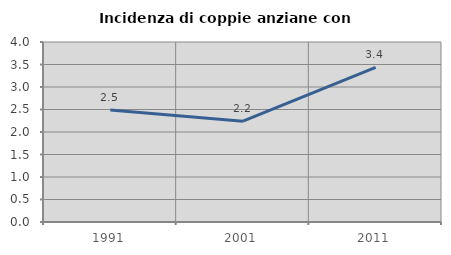
| Category | Incidenza di coppie anziane con figli |
|---|---|
| 1991.0 | 2.488 |
| 2001.0 | 2.24 |
| 2011.0 | 3.436 |